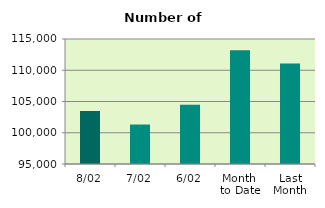
| Category | Series 0 |
|---|---|
| 8/02 | 103468 |
| 7/02 | 101314 |
| 6/02 | 104464 |
| Month 
to Date | 113181 |
| Last
Month | 111077.545 |